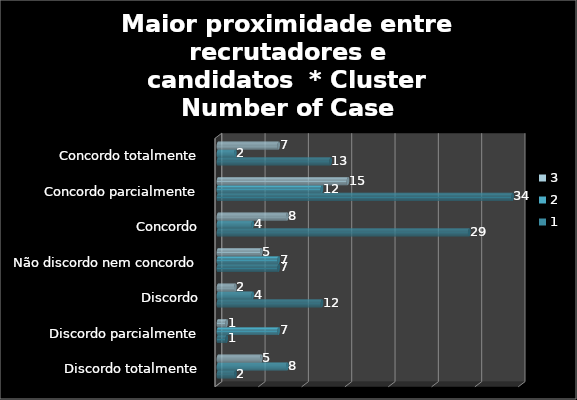
| Category | 1 | 2 | 3 |
|---|---|---|---|
| Discordo totalmente | 2 | 8 | 5 |
| Discordo parcialmente | 1 | 7 | 1 |
| Discordo | 12 | 4 | 2 |
| Não discordo nem concordo | 7 | 7 | 5 |
| Concordo | 29 | 4 | 8 |
| Concordo parcialmente | 34 | 12 | 15 |
| Concordo totalmente | 13 | 2 | 7 |